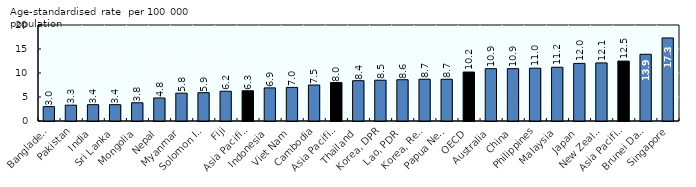
| Category | Total |
|---|---|
| Bangladesh | 3 |
| Pakistan | 3.3 |
| India | 3.4 |
| Sri Lanka | 3.4 |
| Mongolia | 3.8 |
| Nepal | 4.8 |
| Myanmar | 5.8 |
| Solomon Islands | 5.9 |
| Fiji | 6.2 |
| Asia Pacific-LM/L | 6.3 |
| Indonesia  | 6.9 |
| Viet Nam | 7 |
| Cambodia | 7.5 |
| Asia Pacific-UM | 8.02 |
| Thailand | 8.4 |
| Korea, DPR | 8.5 |
| Lao, PDR | 8.6 |
| Korea, Rep. | 8.7 |
| Papua New Guinea | 8.7 |
| OECD | 10.2 |
| Australia | 10.9 |
| China | 10.9 |
| Philippines | 11 |
| Malaysia | 11.2 |
| Japan | 12 |
| New Zealand | 12.1 |
| Asia Pacific-H | 12.483 |
| Brunei Darussalam | 13.9 |
| Singapore | 17.3 |